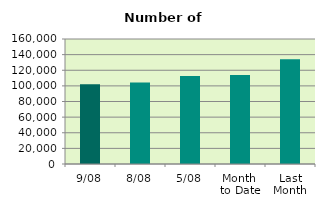
| Category | Series 0 |
|---|---|
| 9/08 | 101932 |
| 8/08 | 104286 |
| 5/08 | 112720 |
| Month 
to Date | 113808.857 |
| Last
Month | 134197.333 |